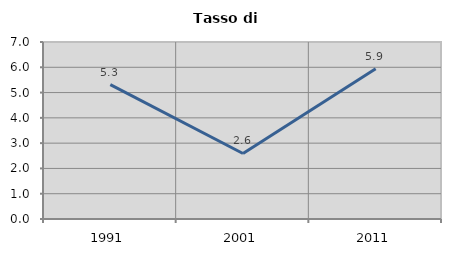
| Category | Tasso di disoccupazione   |
|---|---|
| 1991.0 | 5.317 |
| 2001.0 | 2.592 |
| 2011.0 | 5.944 |